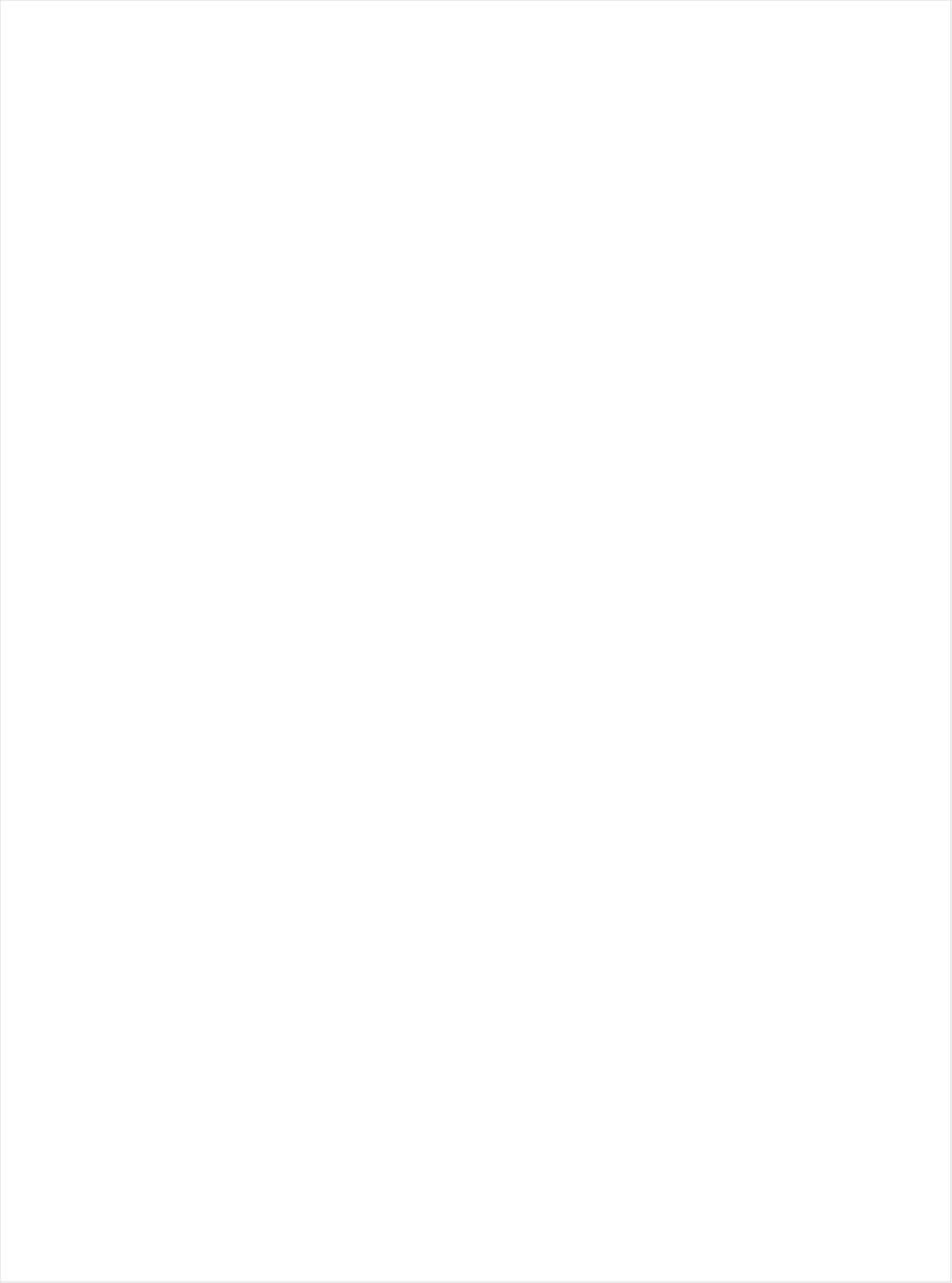
| Category | Total |
|---|---|
| Telemundo | -0.693 |
| UniMas | -0.674 |
| Galavision | -0.617 |
| NBC Universo | -0.58 |
| Univision | -0.553 |
| TUDN | -0.477 |
| Cartoon Network | -0.35 |
| Hallmark Movies & Mysteries | -0.269 |
| Hallmark | -0.225 |
| UP TV | -0.22 |
| Logo | -0.217 |
| Lifetime Movies | -0.15 |
| TLC | -0.147 |
| Discovery Life Channel | -0.144 |
| Nick Toons | -0.132 |
| Disney XD | -0.124 |
| Disney Channel | -0.119 |
| WE TV | -0.109 |
| Adult Swim | -0.107 |
| Travel | -0.1 |
| Nick | -0.097 |
| Teen Nick | -0.094 |
| Oprah Winfrey Network | -0.093 |
| Investigation Discovery | -0.082 |
| Nick@Nite | -0.071 |
| INSP | -0.067 |
| RFD TV | -0.063 |
| VH1 | -0.059 |
| OXYGEN | -0.055 |
| Lifetime | -0.038 |
| Universal Kids | -0.038 |
| PBS | -0.038 |
| Nick Jr. | -0.033 |
| ION | -0.031 |
| E! | -0.02 |
| Discovery Family Channel | -0.019 |
| Headline News | -0.018 |
| BET | -0.015 |
| CMTV | -0.007 |
| BRAVO | -0.003 |
| POP | 0 |
| Great American Country | 0.001 |
| Freeform | 0.005 |
| Disney Junior US | 0.01 |
| TV LAND | 0.012 |
| Science Channel | 0.022 |
| National Geographic Wild | 0.03 |
| MSNBC | 0.03 |
| CW | 0.036 |
| HGTV | 0.036 |
| MTV2 | 0.054 |
| Weather Channel | 0.058 |
| BET Her | 0.059 |
| Animal Planet | 0.069 |
| USA Network | 0.071 |
| Fox Business | 0.073 |
| SYFY | 0.08 |
| TV ONE | 0.084 |
| WGN America | 0.091 |
| A&E | 0.099 |
| Fox News | 0.099 |
| History Channel | 0.102 |
| ABC | 0.112 |
| Ovation | 0.119 |
| Motor Trend Network | 0.125 |
| FXX | 0.129 |
| MTV | 0.132 |
| FX Movie Channel | 0.134 |
| NBC | 0.135 |
| Discovery Channel | 0.135 |
| CBS | 0.137 |
| Reelz Channel | 0.138 |
| FX | 0.138 |
| FYI | 0.139 |
| CNN | 0.14 |
| SundanceTV | 0.141 |
| Food Network | 0.145 |
| American Heroes Channel | 0.148 |
| Game Show | 0.149 |
| Bloomberg HD | 0.15 |
| TBS | 0.162 |
| DIY | 0.162 |
| Paramount Network | 0.168 |
| TNT | 0.177 |
| Smithsonian | 0.18 |
| FOX | 0.192 |
| CNBC | 0.194 |
| AMC | 0.198 |
| Destination America | 0.202 |
| truTV | 0.217 |
| National Geographic | 0.229 |
| Cooking Channel | 0.234 |
| BBC America | 0.237 |
| Tennis Channel | 0.238 |
| Independent Film (IFC) | 0.242 |
| Outdoor Channel | 0.245 |
| Comedy Central | 0.281 |
| Viceland | 0.285 |
| The Sportsman Channel | 0.337 |
| FXDEP | 0.388 |
| ESPN Deportes | 0.422 |
| NBC Sports | 0.447 |
| MyNetworkTV | 0.448 |
| Olympic Channel | 0.513 |
| FOX Sports 2 | 0.545 |
| CBS Sports | 0.594 |
| PAC-12 Network | 0.636 |
| MLB Network | 0.645 |
| NHL | 0.65 |
| Fox Sports 1 | 0.675 |
| Golf | 0.69 |
| NBA TV | 0.718 |
| ESPN2 | 0.734 |
| ESPNEWS | 0.734 |
| ESPN | 0.74 |
| Big Ten Network | 0.749 |
| ESPNU | 0.797 |
| NFL Network | 1.029 |